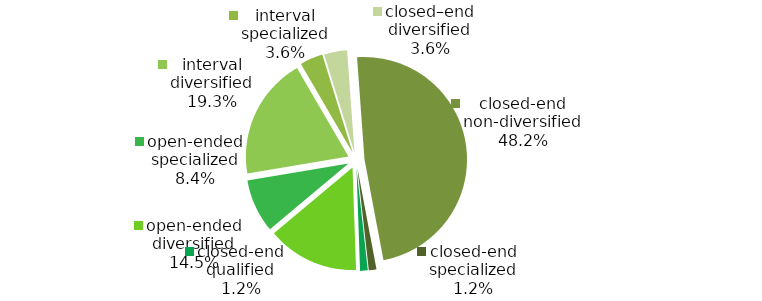
| Category | Series 0 |
|---|---|
| open-ended diversified | 12 |
| open-ended specialized | 7 |
| interval diversified | 16 |
| interval specialized | 3 |
| closed–end diversified | 3 |
| closed-end non-diversified | 40 |
| closed-end specialized | 1 |
| closed-end qualified | 1 |